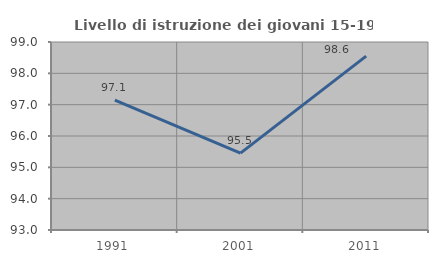
| Category | Livello di istruzione dei giovani 15-19 anni |
|---|---|
| 1991.0 | 97.143 |
| 2001.0 | 95.455 |
| 2011.0 | 98.551 |